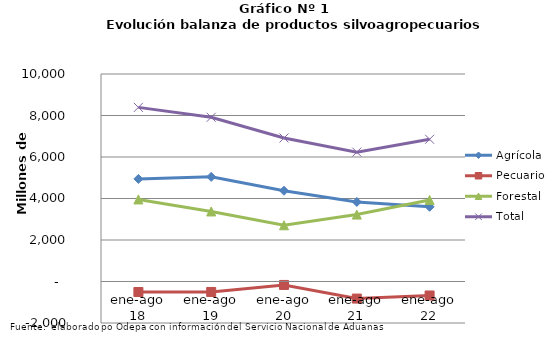
| Category | Agrícola | Pecuario | Forestal | Total |
|---|---|---|---|---|
| ene-ago 18 | 4943760 | -506522 | 3954164 | 8391402 |
| ene-ago 19 | 5042334 | -504194 | 3375441 | 7913581 |
| ene-ago 20 | 4373656 | -166131 | 2708939 | 6916464 |
| ene-ago 21 | 3833554 | -822858 | 3225112 | 6235808 |
| ene-ago 22 | 3599218 | -673722 | 3929718 | 6855214 |